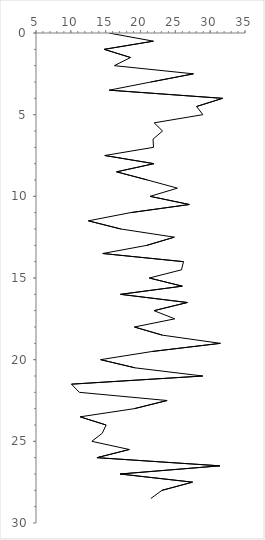
| Category | Series 0 |
|---|---|
| 15.441757547020705 | 0 |
| 21.85185185185185 | 0.5 |
| 14.789440936229928 | 1 |
| 18.568033273915628 | 1.5 |
| 16.244588744588743 | 2 |
| 27.60334903192046 | 2.5 |
| 21.47890283613388 | 3 |
| 15.517705726994718 | 3.5 |
| 31.779331779331784 | 4 |
| 28.04804804804805 | 4.5 |
| 28.950766747376917 | 5 |
| 21.960287283481204 | 5.5 |
| 23.163410663410662 | 6 |
| 21.801346801346806 | 6.5 |
| 21.86611078539943 | 7 |
| 14.873808602031596 | 7.5 |
| 21.929160356722193 | 8 |
| 16.565656565656564 | 8.5 |
| 21.01010101010101 | 9 |
| 25.298295454545457 | 9.5 |
| 21.38047138047138 | 10 |
| 27.01298701298701 | 10.5 |
| 18.546541497361172 | 11 |
| 12.51564064064064 | 11.5 |
| 17.187332259796026 | 12 |
| 24.855699855699857 | 12.5 |
| 20.930232558139537 | 13 |
| 14.58492975734355 | 13.5 |
| 26.172502409251525 | 14 |
| 25.882352941176475 | 14.5 |
| 21.262383426377102 | 15 |
| 25.997150997150996 | 15.5 |
| 17.13354474982382 | 16 |
| 26.726726726726728 | 16.5 |
| 21.937321937321936 | 17 |
| 24.92063492063492 | 17.5 |
| 19.124579124579125 | 18 |
| 23.14621626097036 | 18.5 |
| 31.46853146853147 | 19 |
| 21.64282696602088 | 19.5 |
| 14.273783240733978 | 20 |
| 19.229359899232794 | 20.5 |
| 28.93610013175231 | 21 |
| 10.090966786545376 | 21.5 |
| 11.220433313456569 | 22 |
| 23.820719510374683 | 22.5 |
| 19.107059373539037 | 23 |
| 11.330770713380188 | 23.5 |
| 15.06172839506173 | 24 |
| 14.518518518518519 | 24.5 |
| 13.018631484371305 | 25 |
| 18.394471026049974 | 25.5 |
| 13.75084175084175 | 26 |
| 31.38888888888889 | 26.5 |
| 17.071617071617073 | 27 |
| 27.465127465127466 | 27.5 |
| 23.08743169398907 | 28 |
| 21.48148148148148 | 28.5 |